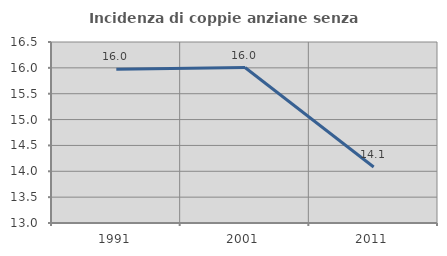
| Category | Incidenza di coppie anziane senza figli  |
|---|---|
| 1991.0 | 15.974 |
| 2001.0 | 16.007 |
| 2011.0 | 14.083 |